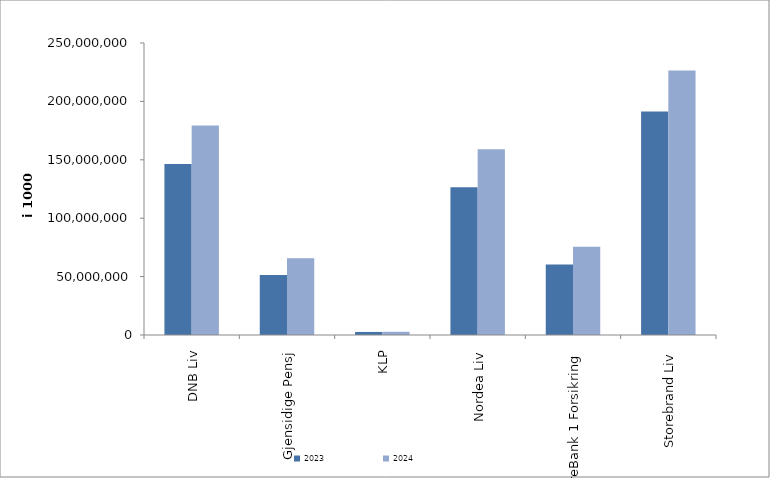
| Category | 2023 | 2024 |
|---|---|---|
| DNB Liv | 146459867.642 | 179449570.928 |
| Gjensidige Pensj | 51422836 | 65817579 |
| KLP | 2609059.097 | 2764463.41 |
| Nordea Liv | 126457560 | 159130080 |
| SpareBank 1 Forsikring | 60413574.038 | 75514311.198 |
| Storebrand Liv | 191251233.176 | 226481801.935 |